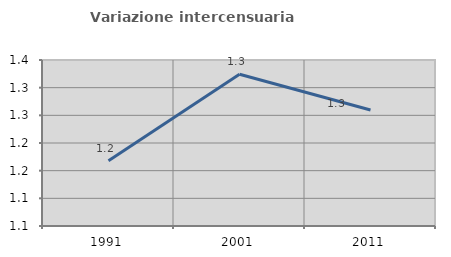
| Category | Variazione intercensuaria annua |
|---|---|
| 1991.0 | 1.168 |
| 2001.0 | 1.324 |
| 2011.0 | 1.26 |